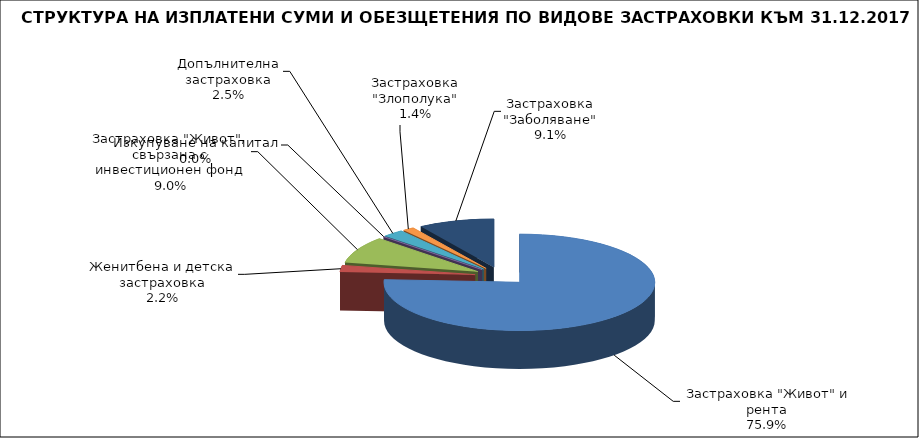
| Category | Series 0 |
|---|---|
|  Застраховка "Живот" и рента | 139965284.952 |
| Женитбена и детска застраховка | 4077483.505 |
| Застраховка "Живот", свързана с инвестиционен фонд | 16514600.463 |
| Изкупуване на капитал | 0 |
| Допълнителна застраховка | 4684834.967 |
| Застраховка "Злополука" | 2502897.525 |
| Застраховка "Заболяване" | 16737227.118 |